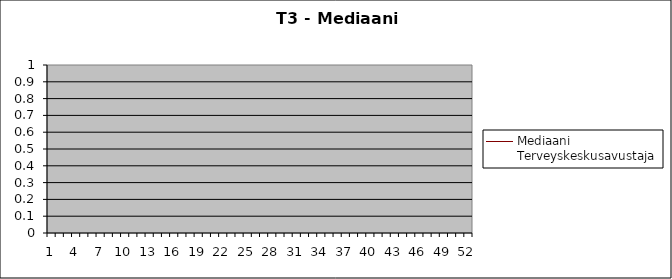
| Category | Mediaani Terveyskeskusavustaja |
|---|---|
| 0 | 0 |
| 1 | 0 |
| 2 | 0 |
| 3 | 0 |
| 4 | 0 |
| 5 | 0 |
| 6 | 0 |
| 7 | 0 |
| 8 | 0 |
| 9 | 0 |
| 10 | 0 |
| 11 | 0 |
| 12 | 0 |
| 13 | 0 |
| 14 | 0 |
| 15 | 0 |
| 16 | 0 |
| 17 | 0 |
| 18 | 0 |
| 19 | 0 |
| 20 | 0 |
| 21 | 0 |
| 22 | 0 |
| 23 | 0 |
| 24 | 0 |
| 25 | 0 |
| 26 | 0 |
| 27 | 0 |
| 28 | 0 |
| 29 | 0 |
| 30 | 0 |
| 31 | 0 |
| 32 | 0 |
| 33 | 0 |
| 34 | 0 |
| 35 | 0 |
| 36 | 0 |
| 37 | 0 |
| 38 | 0 |
| 39 | 0 |
| 40 | 0 |
| 41 | 0 |
| 42 | 0 |
| 43 | 0 |
| 44 | 0 |
| 45 | 0 |
| 46 | 0 |
| 47 | 0 |
| 48 | 0 |
| 49 | 0 |
| 50 | 0 |
| 51 | 0 |